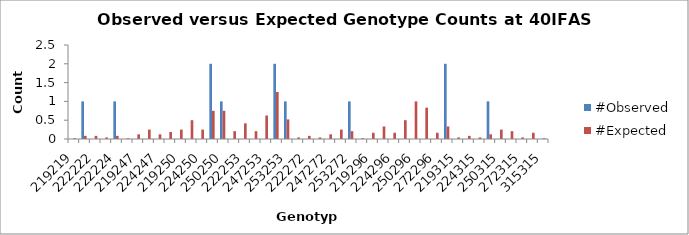
| Category | #Observed | #Expected |
|---|---|---|
| 219219.0 | 0 | 0.021 |
| 219222.0 | 1 | 0.083 |
| 222222.0 | 0 | 0.083 |
| 219224.0 | 0 | 0.042 |
| 222224.0 | 1 | 0.083 |
| 224224.0 | 0 | 0.021 |
| 219247.0 | 0 | 0.125 |
| 222247.0 | 0 | 0.25 |
| 224247.0 | 0 | 0.125 |
| 247247.0 | 0 | 0.188 |
| 219250.0 | 0 | 0.25 |
| 222250.0 | 0 | 0.5 |
| 224250.0 | 0 | 0.25 |
| 247250.0 | 2 | 0.75 |
| 250250.0 | 1 | 0.75 |
| 219253.0 | 0 | 0.208 |
| 222253.0 | 0 | 0.417 |
| 224253.0 | 0 | 0.208 |
| 247253.0 | 0 | 0.625 |
| 250253.0 | 2 | 1.25 |
| 253253.0 | 1 | 0.521 |
| 219272.0 | 0 | 0.042 |
| 222272.0 | 0 | 0.083 |
| 224272.0 | 0 | 0.042 |
| 247272.0 | 0 | 0.125 |
| 250272.0 | 0 | 0.25 |
| 253272.0 | 1 | 0.208 |
| 272272.0 | 0 | 0.021 |
| 219296.0 | 0 | 0.167 |
| 222296.0 | 0 | 0.333 |
| 224296.0 | 0 | 0.167 |
| 247296.0 | 0 | 0.5 |
| 250296.0 | 0 | 1 |
| 253296.0 | 0 | 0.833 |
| 272296.0 | 0 | 0.167 |
| 296296.0 | 2 | 0.333 |
| 219315.0 | 0 | 0.042 |
| 222315.0 | 0 | 0.083 |
| 224315.0 | 0 | 0.042 |
| 247315.0 | 1 | 0.125 |
| 250315.0 | 0 | 0.25 |
| 253315.0 | 0 | 0.208 |
| 272315.0 | 0 | 0.042 |
| 296315.0 | 0 | 0.167 |
| 315315.0 | 0 | 0.021 |